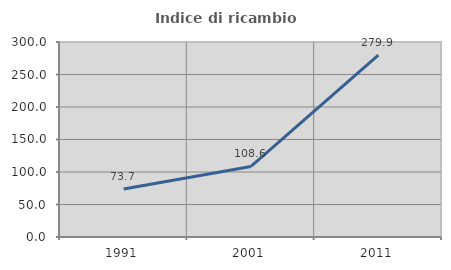
| Category | Indice di ricambio occupazionale  |
|---|---|
| 1991.0 | 73.735 |
| 2001.0 | 108.594 |
| 2011.0 | 279.916 |